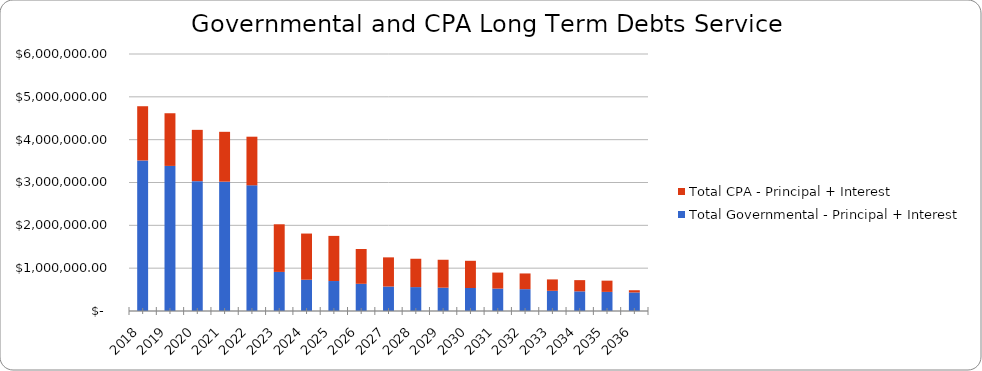
| Category | Total Governmental - Principal + Interest | Total CPA - Principal + Interest |
|---|---|---|
| 2018.0 | 3514425 | 1266199 |
| 2019.0 | 3387050 | 1229780 |
| 2020.0 | 3031825 | 1197299 |
| 2021.0 | 3019425 | 1163949 |
| 2022.0 | 2934512.5 | 1134849 |
| 2023.0 | 912343.75 | 1112161 |
| 2024.0 | 730150 | 1078098 |
| 2025.0 | 699700 | 1053742 |
| 2026.0 | 635100 | 813023 |
| 2027.0 | 571100 | 681117 |
| 2028.0 | 557900 | 661804 |
| 2029.0 | 544700 | 651698 |
| 2030.0 | 536500 | 635655 |
| 2031.0 | 523150 | 374031 |
| 2032.0 | 509800 | 366825 |
| 2033.0 | 471450 | 265925 |
| 2034.0 | 458850 | 261725 |
| 2035.0 | 446250 | 262225 |
| 2036.0 | 433125.02 | 51563 |